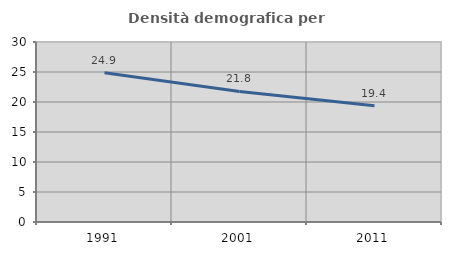
| Category | Densità demografica |
|---|---|
| 1991.0 | 24.891 |
| 2001.0 | 21.756 |
| 2011.0 | 19.357 |